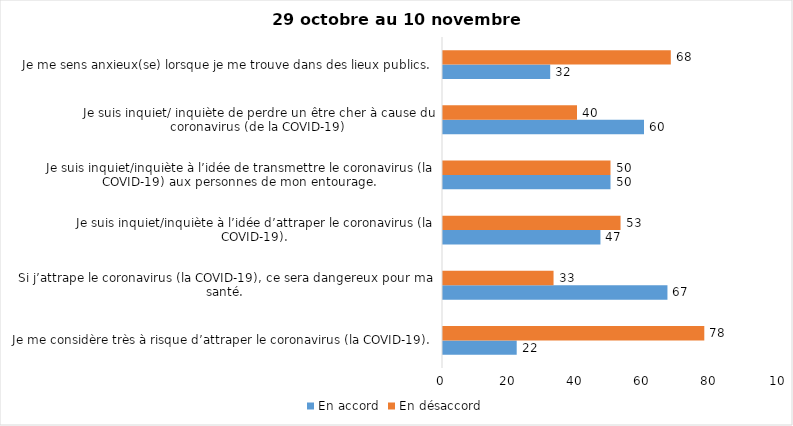
| Category | En accord | En désaccord |
|---|---|---|
| Je me considère très à risque d’attraper le coronavirus (la COVID-19). | 22 | 78 |
| Si j’attrape le coronavirus (la COVID-19), ce sera dangereux pour ma santé. | 67 | 33 |
| Je suis inquiet/inquiète à l’idée d’attraper le coronavirus (la COVID-19). | 47 | 53 |
| Je suis inquiet/inquiète à l’idée de transmettre le coronavirus (la COVID-19) aux personnes de mon entourage. | 50 | 50 |
| Je suis inquiet/ inquiète de perdre un être cher à cause du coronavirus (de la COVID-19) | 60 | 40 |
| Je me sens anxieux(se) lorsque je me trouve dans des lieux publics. | 32 | 68 |